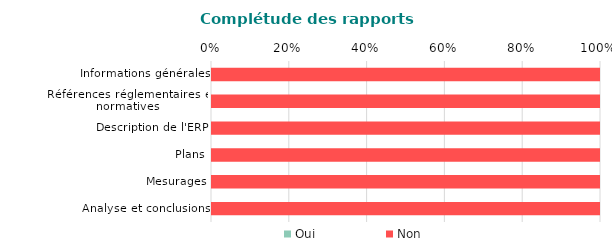
| Category | Oui | Non |
|---|---|---|
| Informations générales | 0 | 1 |
| Références réglementaires et normatives | 0 | 1 |
| Description de l'ERP | 0 | 1 |
| Plans | 0 | 1 |
| Mesurages | 0 | 1 |
| Analyse et conclusions | 0 | 1 |